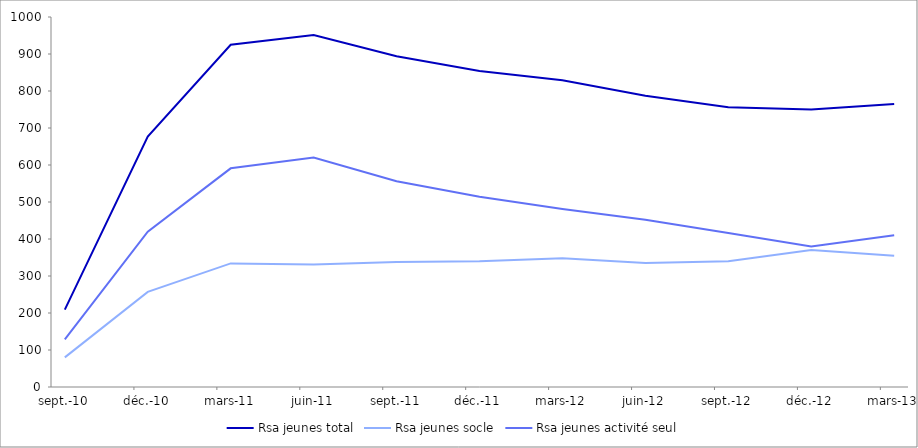
| Category | Rsa jeunes total | Rsa jeunes socle | Rsa jeunes activité seul   |
|---|---|---|---|
| 2010-09-01 | 209 | 80 | 129 |
| 2010-12-01 | 677 | 257 | 420 |
| 2011-03-01 | 925 | 334 | 591 |
| 2011-06-01 | 951 | 331 | 620 |
| 2011-09-01 | 894 | 338 | 556 |
| 2011-12-01 | 854 | 340 | 514 |
| 2012-03-01 | 829 | 348 | 481 |
| 2012-06-01 | 787 | 335 | 452 |
| 2012-09-01 | 756 | 340 | 416 |
| 2012-12-31 | 750 | 370 | 380 |
| 2013-03-31 | 765 | 355 | 410 |